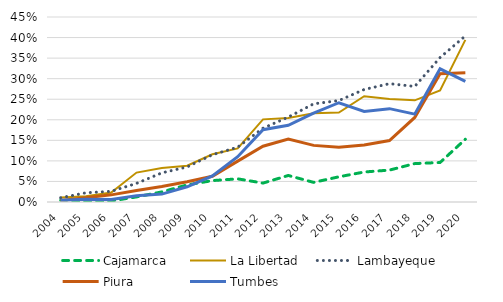
| Category | Cajamarca | La Libertad | Lambayeque | Piura | Tumbes |
|---|---|---|---|---|---|
| 2004.0 | 0.004 | 0.011 | 0.01 | 0.004 | 0.004 |
| 2005.0 | 0.003 | 0.014 | 0.022 | 0.011 | 0.007 |
| 2006.0 | 0.003 | 0.023 | 0.026 | 0.017 | 0.006 |
| 2007.0 | 0.012 | 0.072 | 0.045 | 0.028 | 0.015 |
| 2008.0 | 0.025 | 0.083 | 0.071 | 0.038 | 0.019 |
| 2009.0 | 0.042 | 0.088 | 0.085 | 0.049 | 0.037 |
| 2010.0 | 0.052 | 0.116 | 0.115 | 0.063 | 0.064 |
| 2011.0 | 0.056 | 0.13 | 0.133 | 0.099 | 0.11 |
| 2012.0 | 0.046 | 0.201 | 0.179 | 0.136 | 0.176 |
| 2013.0 | 0.065 | 0.204 | 0.207 | 0.153 | 0.187 |
| 2014.0 | 0.048 | 0.216 | 0.239 | 0.138 | 0.216 |
| 2015.0 | 0.061 | 0.218 | 0.247 | 0.133 | 0.241 |
| 2016.0 | 0.073 | 0.257 | 0.274 | 0.139 | 0.22 |
| 2017.0 | 0.078 | 0.25 | 0.288 | 0.149 | 0.227 |
| 2018.0 | 0.093 | 0.247 | 0.281 | 0.206 | 0.214 |
| 2019.0 | 0.096 | 0.271 | 0.351 | 0.312 | 0.324 |
| 2020.0 | 0.153 | 0.394 | 0.404 | 0.314 | 0.293 |